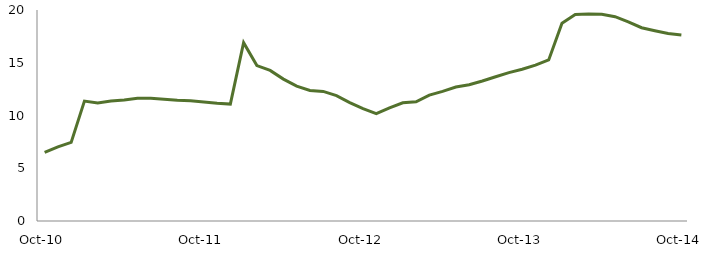
| Category | Series 0 |
|---|---|
| Oct-10 | 6.496 |
|  | 7.032 |
|  | 7.452 |
|  | 11.37 |
|  | 11.198 |
|  | 11.376 |
|  | 11.48 |
|  | 11.628 |
|  | 11.638 |
|  | 11.549 |
|  | 11.441 |
|  | 11.392 |
| Oct-11 | 11.289 |
|  | 11.163 |
|  | 11.08 |
|  | 16.903 |
|  | 14.732 |
|  | 14.273 |
|  | 13.449 |
|  | 12.778 |
|  | 12.379 |
|  | 12.281 |
|  | 11.878 |
|  | 11.225 |
| Oct-12 | 10.643 |
|  | 10.175 |
|  | 10.732 |
|  | 11.199 |
|  | 11.297 |
|  | 11.935 |
|  | 12.289 |
|  | 12.699 |
|  | 12.911 |
|  | 13.266 |
|  | 13.675 |
|  | 14.064 |
| Oct-13 | 14.382 |
|  | 14.778 |
|  | 15.268 |
|  | 18.737 |
|  | 19.583 |
|  | 19.624 |
|  | 19.606 |
|  | 19.369 |
|  | 18.883 |
|  | 18.323 |
|  | 18.035 |
|  | 17.769 |
| Oct-14 | 17.641 |